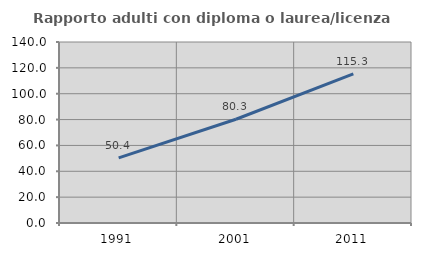
| Category | Rapporto adulti con diploma o laurea/licenza media  |
|---|---|
| 1991.0 | 50.394 |
| 2001.0 | 80.255 |
| 2011.0 | 115.306 |